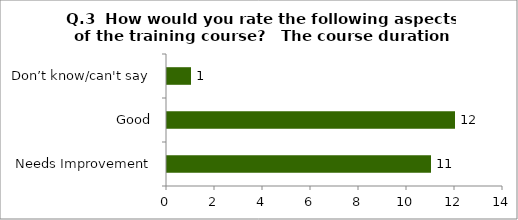
| Category | Q.3  How would you rate the following aspects of the training course?  |
|---|---|
| Needs Improvement | 11 |
| Good | 12 |
| Don’t know/can't say | 1 |